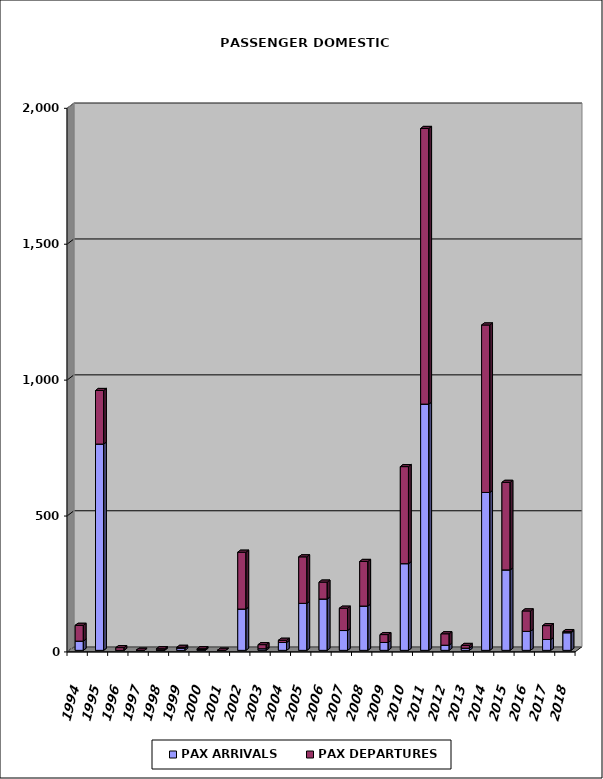
| Category | PAX ARRIVALS | PAX DEPARTURES |
|---|---|---|
| 1994.0 | 34 | 58 |
| 1995.0 | 759 | 197 |
| 1996.0 | 0 | 10 |
| 1997.0 | 0 | 0 |
| 1998.0 | 2 | 4 |
| 1999.0 | 8 | 3 |
| 2000.0 | 3 | 3 |
| 2001.0 | 0 | 0 |
| 2002.0 | 152 | 209 |
| 2003.0 | 6 | 15 |
| 2004.0 | 29 | 8 |
| 2005.0 | 173 | 171 |
| 2006.0 | 189 | 62 |
| 2007.0 | 73 | 82 |
| 2008.0 | 163 | 164 |
| 2009.0 | 29 | 29 |
| 2010.0 | 319 | 357 |
| 2011.0 | 906 | 1014 |
| 2012.0 | 19 | 42 |
| 2013.0 | 8 | 10 |
| 2014.0 | 581 | 616 |
| 2015.0 | 296 | 322 |
| 2016.0 | 70 | 75 |
| 2017.0 | 40 | 51 |
| 2018.0 | 65 | 4 |